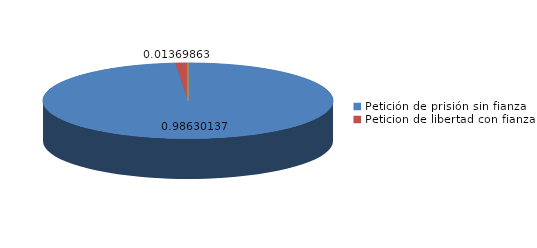
| Category | Series 0 |
|---|---|
| Petición de prisión sin fianza | 72 |
| Peticion de libertad con fianza | 1 |
| Petición de libertad | 0 |